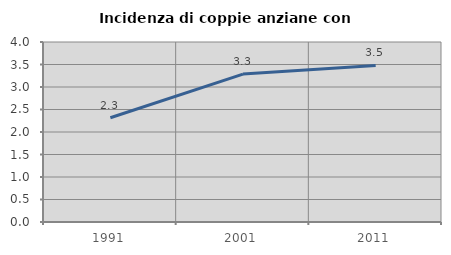
| Category | Incidenza di coppie anziane con figli |
|---|---|
| 1991.0 | 2.317 |
| 2001.0 | 3.287 |
| 2011.0 | 3.479 |